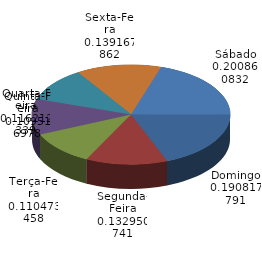
| Category | Qtde Vítimas |
|---|---|
| Domingo | 399 |
| Segunda-Feira | 278 |
| Terça-Feira | 231 |
| Quarta-Feira | 243 |
| Quinta-Feira | 229 |
| Sexta-Feira | 291 |
| Sábado | 420 |